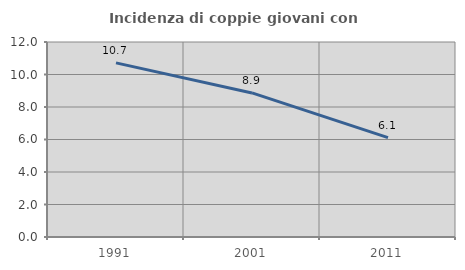
| Category | Incidenza di coppie giovani con figli |
|---|---|
| 1991.0 | 10.714 |
| 2001.0 | 8.867 |
| 2011.0 | 6.111 |